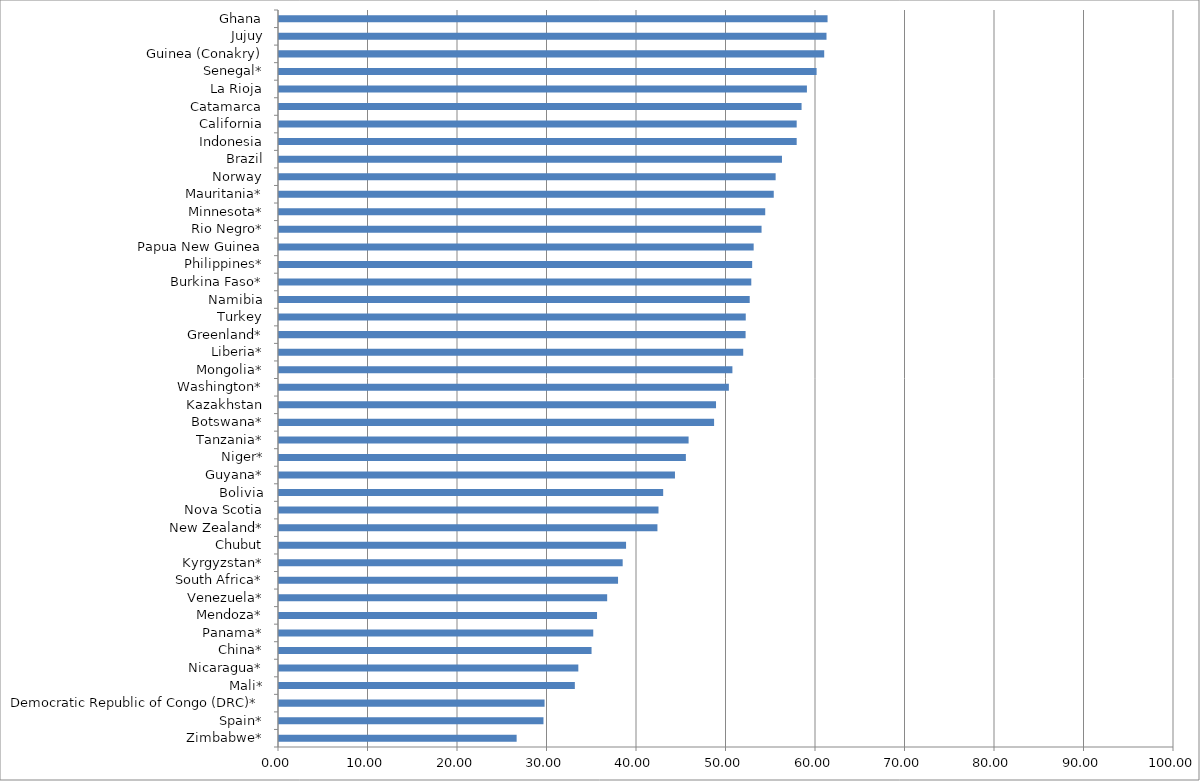
| Category | Series 0 |
|---|---|
| Zimbabwe* | 26.552 |
| Spain* | 29.55 |
| Democratic Republic of Congo (DRC)* | 29.672 |
| Mali* | 33.055 |
| Nicaragua* | 33.444 |
| China* | 34.922 |
| Panama* | 35.112 |
| Mendoza* | 35.535 |
| Venezuela* | 36.667 |
| South Africa* | 37.882 |
| Kyrgyzstan* | 38.4 |
| Chubut | 38.778 |
| New Zealand* | 42.283 |
| Nova Scotia | 42.401 |
| Bolivia | 42.925 |
| Guyana* | 44.242 |
| Niger* | 45.46 |
| Tanzania* | 45.764 |
| Botswana* | 48.613 |
| Kazakhstan | 48.83 |
| Washington* | 50.265 |
| Mongolia* | 50.659 |
| Liberia* | 51.868 |
| Greenland* | 52.133 |
| Turkey | 52.152 |
| Namibia | 52.594 |
| Burkina Faso* | 52.77 |
| Philippines* | 52.868 |
| Papua New Guinea | 53.035 |
| Rio Negro* | 53.917 |
| Minnesota* | 54.327 |
| Mauritania* | 55.28 |
| Norway | 55.49 |
| Brazil | 56.198 |
| Indonesia | 57.842 |
| California | 57.842 |
| Catamarca | 58.388 |
| La Rioja | 58.985 |
| Senegal* | 60.067 |
| Guinea (Conakry) | 60.917 |
| Jujuy | 61.173 |
| Ghana | 61.291 |